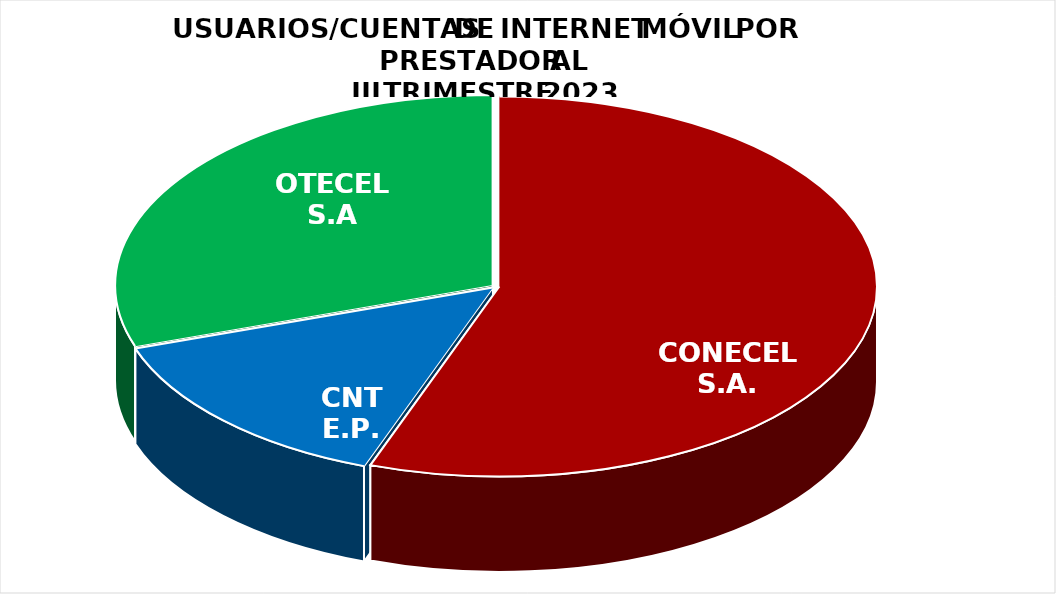
| Category | Series 0 |
|---|---|
| CONECEL S.A. | 6165886 |
| CNT E.P. | 1580904 |
| OTECEL S.A | 3353215 |